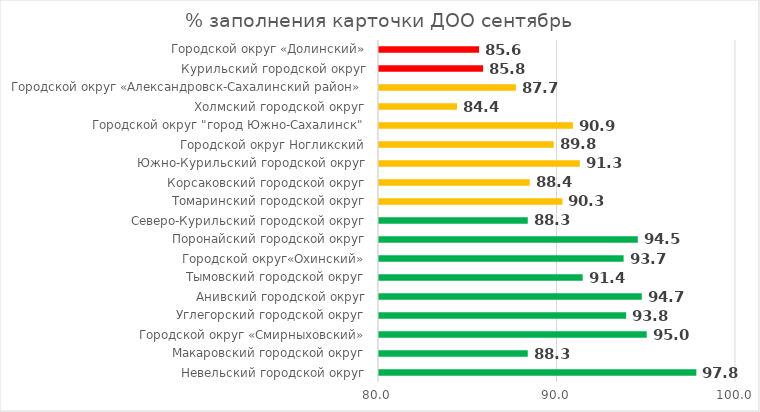
| Category | Series 0 |
|---|---|
| Невельский городской округ | 97.778 |
| Макаровский городской округ | 88.333 |
| Городской округ «Смирныховский» | 95 |
| Углегорский городской округ | 93.846 |
| Анивский городской округ | 94.722 |
| Тымовский городской округ | 91.41 |
| Городской округ«Охинский» | 93.704 |
| Поронайский городской округ | 94.5 |
| Северо-Курильский городской округ | 88.333 |
| Томаринский городской округ | 90.278 |
| Корсаковский городской округ | 88.444 |
| Южно-Курильский городской округ | 91.25 |
| Городской округ Ногликский | 89.792 |
| Городской округ "город Южно-Сахалинск" | 90.864 |
| Холмский городской округ | 84.375 |
| Городской округ «Александровск-Сахалинский район»  | 87.667 |
| Курильский городской округ | 85.833 |
| Городской округ «Долинский» | 85.606 |